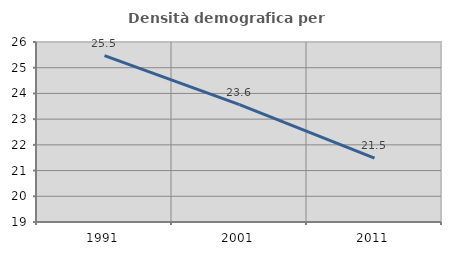
| Category | Densità demografica |
|---|---|
| 1991.0 | 25.47 |
| 2001.0 | 23.562 |
| 2011.0 | 21.487 |